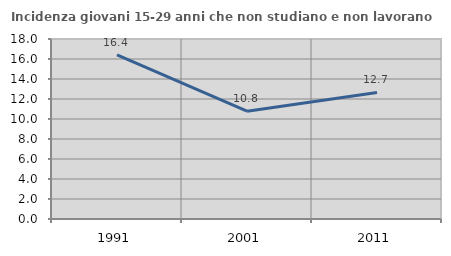
| Category | Incidenza giovani 15-29 anni che non studiano e non lavorano  |
|---|---|
| 1991.0 | 16.406 |
| 2001.0 | 10.784 |
| 2011.0 | 12.661 |